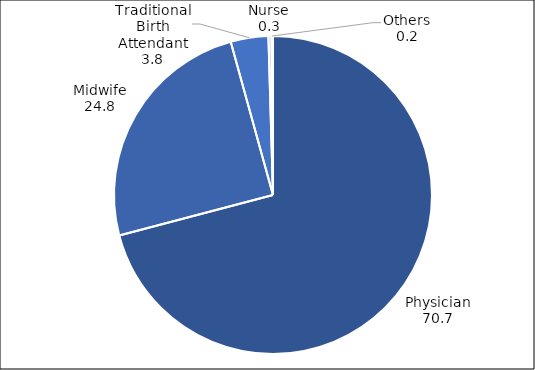
| Category | Series 0 |
|---|---|
| Physician | 70.731 |
| Midwife | 24.756 |
| Traditional Birth Attendant | 3.819 |
| Nurse | 0.299 |
| Others | 0.16 |